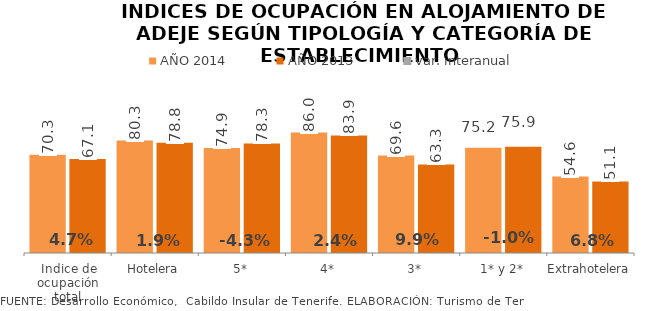
| Category | AÑO 2014 | AÑO 2013 |
|---|---|---|
| Indice de ocupación total | 70.254 | 67.076 |
| Hotelera | 80.284 | 78.799 |
| 5* | 74.922 | 78.294 |
| 4* | 85.991 | 83.935 |
| 3* | 69.558 | 63.288 |
| 1* y 2* | 75.185 | 75.908 |
| Extrahotelera | 54.597 | 51.133 |